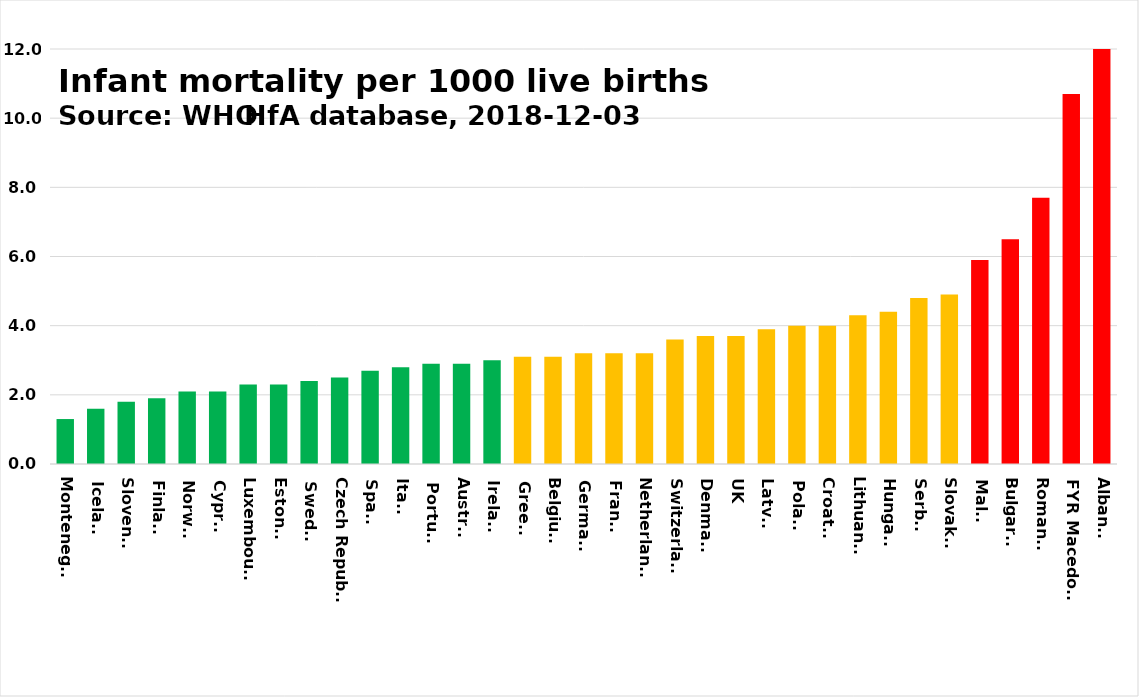
| Category | Series 0 |
|---|---|
| Montenegro | 1.3 |
| Iceland | 1.6 |
| Slovenia | 1.8 |
| Finland | 1.9 |
| Norway | 2.1 |
| Cyprus | 2.1 |
| Luxembourg | 2.3 |
| Estonia | 2.3 |
| Sweden | 2.4 |
| Czech Republic | 2.5 |
| Spain | 2.7 |
| Italy | 2.8 |
| Portugal | 2.9 |
| Austria | 2.9 |
| Ireland | 3 |
| Greece | 3.1 |
| Belgium | 3.1 |
| Germany | 3.2 |
| France | 3.2 |
| Netherlands | 3.2 |
| Switzerland | 3.6 |
| Denmark | 3.7 |
| UK | 3.7 |
| Latvia | 3.9 |
| Poland | 4 |
| Croatia | 4 |
| Lithuania | 4.3 |
| Hungary | 4.4 |
| Serbia | 4.8 |
| Slovakia | 4.9 |
| Malta | 5.9 |
| Bulgaria | 6.5 |
| Romania | 7.7 |
| FYR Macedonia | 10.7 |
| Albania | 12 |